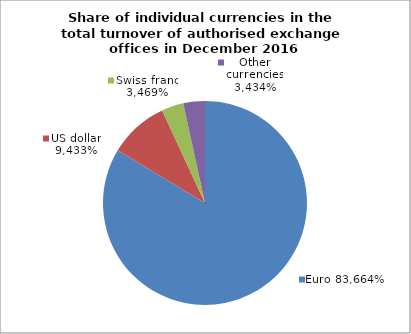
| Category | EUR |
|---|---|
| 0.716079492598274 | 0.837 |
| 0.2839199572999224 | 0.094 |
| 5.501018035729667e-07 | 0.035 |